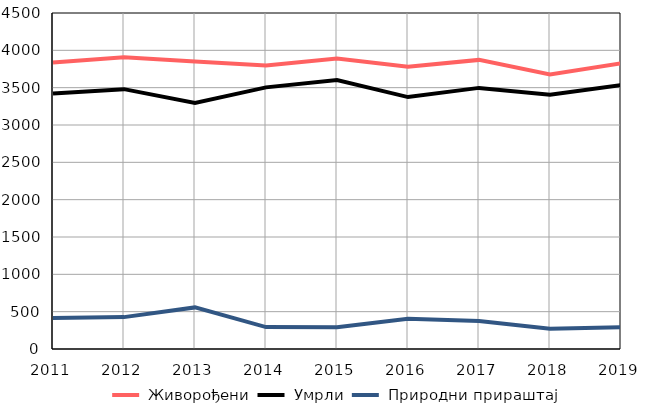
| Category |  Живорођени |  Умрли |  Природни прираштај |
|---|---|---|---|
| 2011.0 | 3838 | 3422 | 416 |
| 2012.0 | 3907 | 3480 | 427 |
| 2013.0 | 3852 | 3295 | 557 |
| 2014.0 | 3797 | 3504 | 293 |
| 2015.0 | 3892 | 3601 | 291 |
| 2016.0 | 3779 | 3374 | 405 |
| 2017.0 | 3872 | 3497 | 375 |
| 2018.0 | 3676 | 3405 | 271 |
| 2019.0 | 3826 | 3535 | 291 |